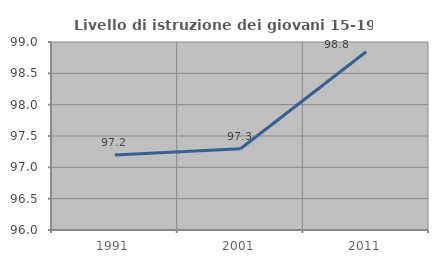
| Category | Livello di istruzione dei giovani 15-19 anni |
|---|---|
| 1991.0 | 97.196 |
| 2001.0 | 97.297 |
| 2011.0 | 98.844 |